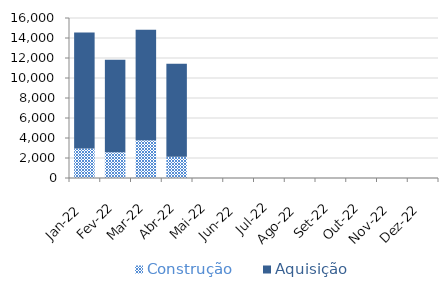
| Category | Construção | Aquisição  |
|---|---|---|
| Jan-22 | 2956.438 | 11598.93 |
| Fev-22 | 2568.19 | 9260.524 |
| Mar-22 | 3770.358 | 11052.944 |
| Abr-22 | 2115.17 | 9299.957 |
| Mai-22 | 0 | 0 |
| Jun-22 | 0 | 0 |
| Jul-22 | 0 | 0 |
| Ago-22 | 0 | 0 |
| Set-22 | 0 | 0 |
| Out-22 | 0 | 0 |
| Nov-22 | 0 | 0 |
| Dez-22 | 0 | 0 |